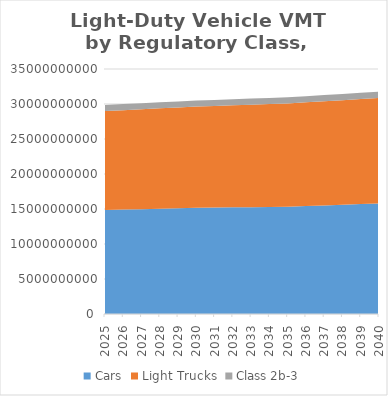
| Category | Cars | Light Trucks | Class 2b-3 |
|---|---|---|---|
| 2025.0 | 14856190513.231 | 14139135314 | 871004905.231 |
| 2026.0 | 14919032939.385 | 14205697520 | 867363975.385 |
| 2027.0 | 14981875365.538 | 14272259726 | 863723045.538 |
| 2028.0 | 15044717791.692 | 14338821932 | 860082115.692 |
| 2029.0 | 15107560217.846 | 14405384138 | 856441185.846 |
| 2030.0 | 15170402644 | 14471946344 | 852800256 |
| 2031.0 | 15201345063.474 | 14528118539.147 | 857430485.044 |
| 2032.0 | 15232287482.949 | 14584290734.294 | 862060714.088 |
| 2033.0 | 15263229902.423 | 14640462929.44 | 866690943.131 |
| 2034.0 | 15294172321.898 | 14696635124.587 | 871321172.175 |
| 2035.0 | 15325114741.372 | 14752807319.734 | 875951401.219 |
| 2036.0 | 15419856618.698 | 14814111122.987 | 880655714.575 |
| 2037.0 | 15514598496.023 | 14875414926.24 | 885360027.931 |
| 2038.0 | 15609340373.349 | 14936718729.494 | 890064341.288 |
| 2039.0 | 15704082250.674 | 14998022532.747 | 894768654.644 |
| 2040.0 | 15798824128 | 15059326336 | 899472968 |